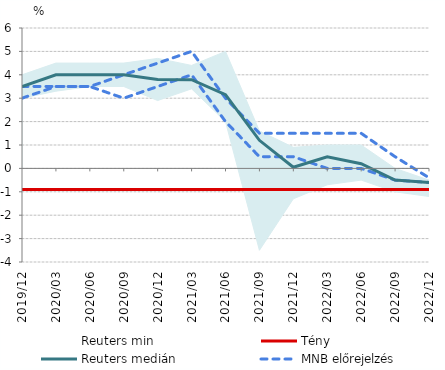
| Category | MNB előrejelzés | Reuters medián | Tény |
|---|---|---|---|
| 2020-12-01 | 3.5 | 3.5 | -0.9 |
| 2021-03-01 | 3.5 | 4 | -0.9 |
| 2021-06-01 | 3.5 | 4 | -0.9 |
| 2021-09-01 | 4 | 4 | -0.9 |
| 2021-12-01 | 4.5 | 3.8 | -0.9 |
| 2022-03-01 | 5 | 3.79 | -0.9 |
| 2022-06-01 | 3 | 3.15 | -0.9 |
| 2022-09-01 | 1.5 | 1.2 | -0.9 |
| 2022-12-01 | 1.5 | 0.05 | -0.9 |
| 2023-03-01 | 1.5 | 0.5 | -0.9 |
| 2023-06-01 | 1.5 | 0.2 | -0.9 |
| 2023-09-01 | 0.5 | -0.5 | -0.9 |
| 2023-12-01 | -0.4 | -0.6 | -0.9 |